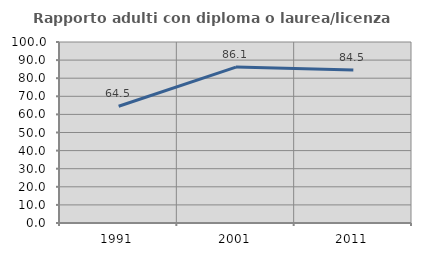
| Category | Rapporto adulti con diploma o laurea/licenza media  |
|---|---|
| 1991.0 | 64.516 |
| 2001.0 | 86.139 |
| 2011.0 | 84.483 |